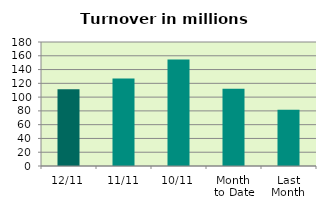
| Category | Series 0 |
|---|---|
| 12/11 | 111.576 |
| 11/11 | 127.158 |
| 10/11 | 154.771 |
| Month 
to Date | 112.159 |
| Last
Month | 81.795 |